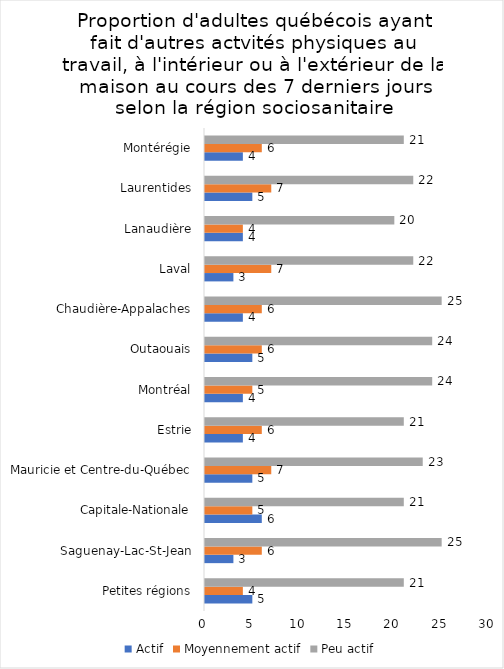
| Category | Actif | Moyennement actif | Peu actif |
|---|---|---|---|
| Petites régions | 5 | 4 | 21 |
| Saguenay-Lac-St-Jean | 3 | 6 | 25 |
| Capitale-Nationale | 6 | 5 | 21 |
| Mauricie et Centre-du-Québec | 5 | 7 | 23 |
| Estrie | 4 | 6 | 21 |
| Montréal | 4 | 5 | 24 |
| Outaouais | 5 | 6 | 24 |
| Chaudière-Appalaches | 4 | 6 | 25 |
| Laval | 3 | 7 | 22 |
| Lanaudière | 4 | 4 | 20 |
| Laurentides | 5 | 7 | 22 |
| Montérégie | 4 | 6 | 21 |